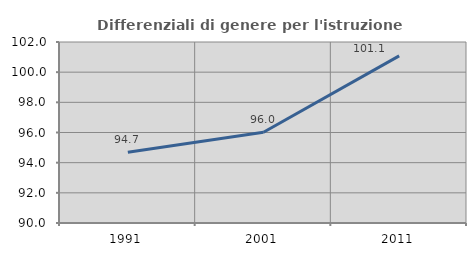
| Category | Differenziali di genere per l'istruzione superiore |
|---|---|
| 1991.0 | 94.688 |
| 2001.0 | 96.02 |
| 2011.0 | 101.081 |